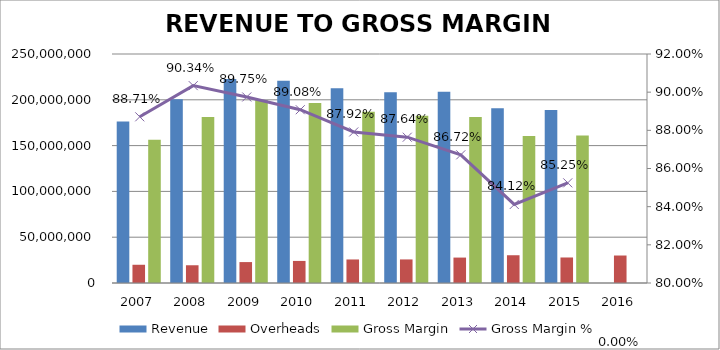
| Category | Revenue | Overheads | Gross Margin |
|---|---|---|---|
| 2007.0 | 176291985 | 19906817 | 156385168 |
| 2008.0 | 200548462 | 19370180 | 181178282 |
| 2009.0 | 222745970 | 22836326 | 199909644 |
| 2010.0 | 220713333 | 24102843 | 196610490 |
| 2011.0 | 212626773 | 25694195 | 186932578 |
| 2012.0 | 208185792 | 25730439 | 182455353 |
| 2013.0 | 208918294 | 27752915 | 181165379 |
| 2014.0 | 190818447 | 30309776 | 160508671 |
| 2015.0 | 188835828 | 27857557 | 160978271 |
| 2016.0 | 0 | 30009845 | 0 |